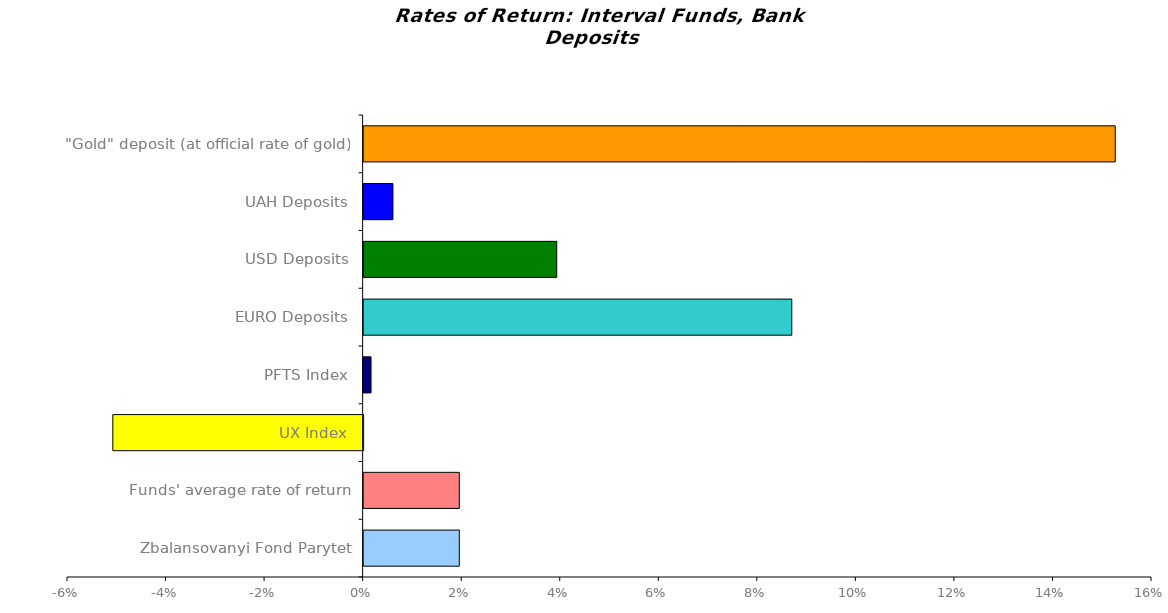
| Category | Series 0 |
|---|---|
| Zbalansovanyi Fond Parytet | 0.019 |
| Funds' average rate of return | 0.019 |
| UX Index | -0.051 |
| PFTS Index | 0.002 |
| EURO Deposits | 0.087 |
| USD Deposits | 0.039 |
| UAH Deposits | 0.006 |
| "Gold" deposit (at official rate of gold) | 0.153 |